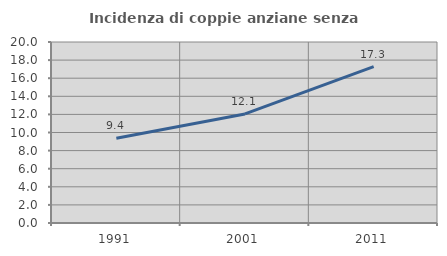
| Category | Incidenza di coppie anziane senza figli  |
|---|---|
| 1991.0 | 9.375 |
| 2001.0 | 12.055 |
| 2011.0 | 17.273 |